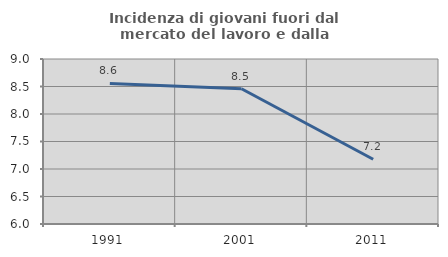
| Category | Incidenza di giovani fuori dal mercato del lavoro e dalla formazione  |
|---|---|
| 1991.0 | 8.555 |
| 2001.0 | 8.46 |
| 2011.0 | 7.177 |